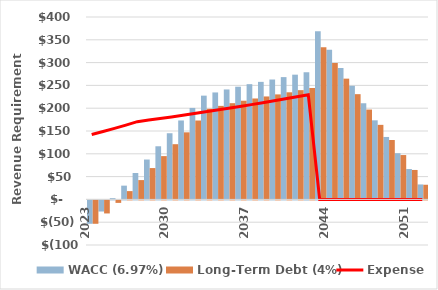
| Category | WACC (6.97%) | Long-Term Debt (4%) |
|---|---|---|
| 2023.0 | -51.291 | -51.291 |
| 2024.0 | -24.389 | -28.611 |
| 2025.0 | 2.758 | -5.46 |
| 2026.0 | 30.162 | 18.187 |
| 2027.0 | 57.84 | 42.356 |
| 2028.0 | 87.435 | 68.7 |
| 2029.0 | 116.519 | 94.939 |
| 2030.0 | 145.082 | 121.069 |
| 2031.0 | 173.113 | 147.089 |
| 2032.0 | 200.602 | 172.996 |
| 2033.0 | 227.538 | 198.788 |
| 2034.0 | 234.554 | 205.107 |
| 2035.0 | 241.093 | 210.983 |
| 2036.0 | 247.147 | 216.397 |
| 2037.0 | 252.705 | 221.327 |
| 2038.0 | 257.759 | 225.754 |
| 2039.0 | 262.914 | 230.269 |
| 2040.0 | 268.172 | 234.874 |
| 2041.0 | 273.536 | 239.572 |
| 2042.0 | 279.007 | 244.363 |
| 2043.0 | 368.963 | 333.627 |
| 2044.0 | 328.195 | 299.098 |
| 2045.0 | 288.242 | 264.815 |
| 2046.0 | 249.121 | 230.783 |
| 2047.0 | 210.848 | 197.006 |
| 2048.0 | 173.441 | 163.489 |
| 2049.0 | 136.916 | 130.238 |
| 2050.0 | 101.291 | 97.258 |
| 2051.0 | 66.585 | 64.555 |
| 2052.0 | 32.815 | 32.134 |